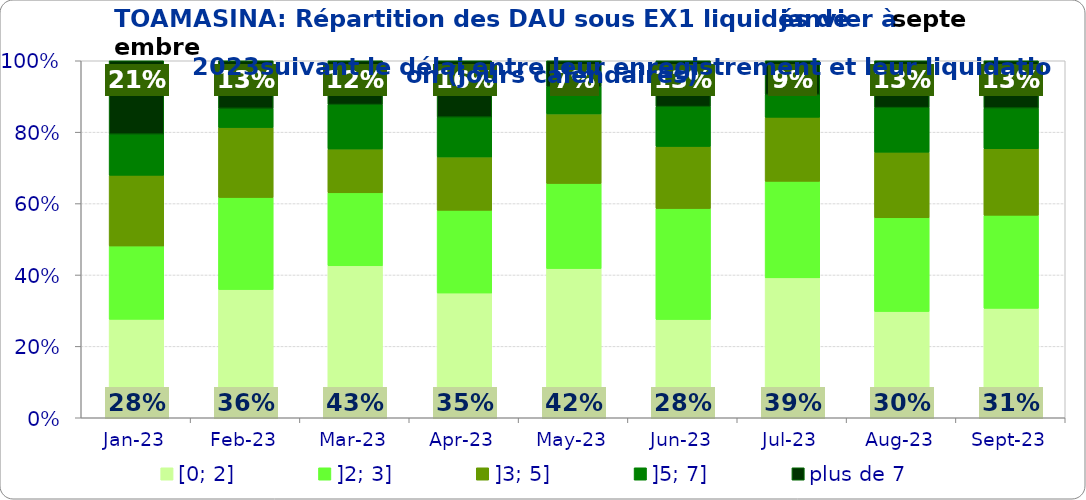
| Category | [0; 2] | ]2; 3] | ]3; 5] | ]5; 7] | plus de 7 |
|---|---|---|---|---|---|
| 2023-01-01 | 0.276 | 0.206 | 0.198 | 0.115 | 0.206 |
| 2023-02-01 | 0.359 | 0.258 | 0.196 | 0.054 | 0.133 |
| 2023-03-01 | 0.426 | 0.204 | 0.123 | 0.125 | 0.123 |
| 2023-04-01 | 0.349 | 0.232 | 0.149 | 0.112 | 0.158 |
| 2023-05-01 | 0.418 | 0.239 | 0.195 | 0.076 | 0.073 |
| 2023-06-01 | 0.275 | 0.311 | 0.174 | 0.111 | 0.128 |
| 2023-07-01 | 0.392 | 0.27 | 0.18 | 0.064 | 0.095 |
| 2023-08-01 | 0.298 | 0.263 | 0.184 | 0.125 | 0.131 |
| 2023-09-01 | 0.306 | 0.261 | 0.186 | 0.114 | 0.133 |